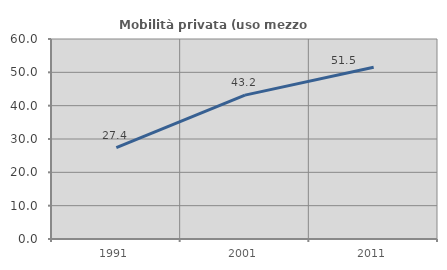
| Category | Mobilità privata (uso mezzo privato) |
|---|---|
| 1991.0 | 27.405 |
| 2001.0 | 43.154 |
| 2011.0 | 51.515 |